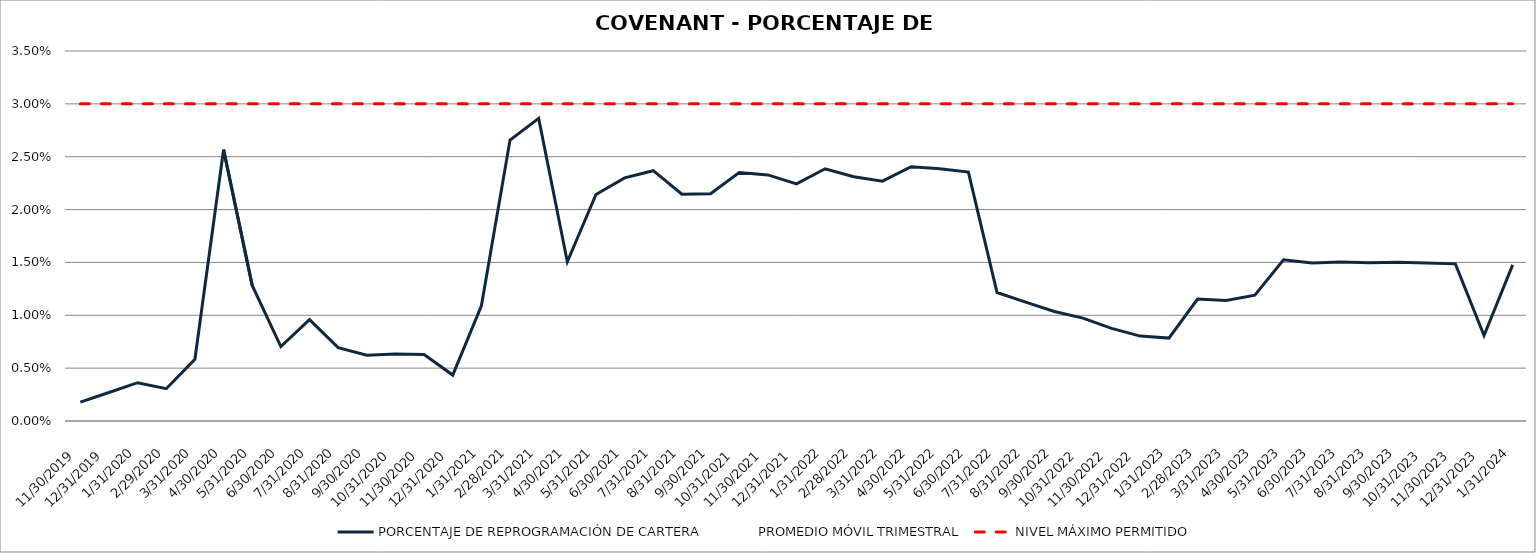
| Category | PORCENTAJE DE REPROGRAMACIÓN DE CARTERA | PROMEDIO MÓVIL TRIMESTRAL | NIVEL MÁXIMO PERMITIDO |
|---|---|---|---|
| 11/30/19 | 0.002 | 0 | 0.03 |
| 12/31/19 | 0.003 | 0 | 0.03 |
| 1/31/20 | 0.004 | 0.003 | 0.03 |
| 2/29/20 | 0.003 | 0.003 | 0.03 |
| 3/31/20 | 0.006 | 0.004 | 0.03 |
| 4/30/20 | 0.026 | 0.012 | 0.03 |
| 5/31/20 | 0.013 | 0.015 | 0.03 |
| 6/30/20 | 0.007 | 0.015 | 0.03 |
| 7/31/20 | 0.01 | 0.01 | 0.03 |
| 8/31/20 | 0.007 | 0.008 | 0.03 |
| 9/30/20 | 0.006 | 0.008 | 0.03 |
| 10/31/20 | 0.006 | 0.007 | 0.03 |
| 11/30/20 | 0.006 | 0.006 | 0.03 |
| 12/31/20 | 0.004 | 0.006 | 0.03 |
| 1/31/21 | 0.011 | 0.007 | 0.03 |
| 2/28/21 | 0.027 | 0.019 | 0.03 |
| 3/31/21 | 0.029 | 0.022 | 0.03 |
| 4/30/21 | 0.015 | 0.023 | 0.03 |
| 5/31/21 | 0.021 | 0.022 | 0.03 |
| 6/30/21 | 0.023 | 0.02 | 0.03 |
| 7/31/21 | 0.024 | 0.023 | 0.03 |
| 8/31/21 | 0.021 | 0.023 | 0.03 |
| 9/30/21 | 0.022 | 0.022 | 0.03 |
| 10/31/21 | 0.024 | 0.022 | 0.03 |
| 11/30/21 | 0.023 | 0.023 | 0.03 |
| 12/31/21 | 0.022 | 0.023 | 0.03 |
| 1/31/22 | 0.024 | 0.023 | 0.03 |
| 2/28/22 | 0.023 | 0.023 | 0.03 |
| 3/31/22 | 0.023 | 0.023 | 0.03 |
| 4/30/22 | 0.024 | 0.023 | 0.03 |
| 5/31/22 | 0.024 | 0.023 | 0.03 |
| 6/30/22 | 0.024 | 0.024 | 0.03 |
| 7/31/22 | 0.012 | 0.02 | 0.03 |
| 8/31/22 | 0.011 | 0.016 | 0.03 |
| 9/30/22 | 0.01 | 0.014 | 0.03 |
| 10/31/22 | 0.01 | 0.013 | 0.03 |
| 11/30/22 | 0.009 | 0.01 | 0.03 |
| 12/31/22 | 0.008 | 0.009 | 0.03 |
| 1/31/23 | 0.008 | 0.008 | 0.03 |
| 2/28/23 | 0.012 | 0.009 | 0.03 |
| 3/31/23 | 0.011 | 0.01 | 0.03 |
| 4/30/23 | 0.012 | 0.012 | 0.03 |
| 5/31/23 | 0.015 | 0.013 | 0.03 |
| 6/30/23 | 0.015 | 0.014 | 0.03 |
| 7/31/23 | 0.015 | 0.015 | 0.03 |
| 8/31/23 | 0.015 | 0.015 | 0.03 |
| 9/30/23 | 0.015 | 0.015 | 0.03 |
| 10/31/23 | 0.015 | 0.015 | 0.03 |
| 11/30/23 | 0.015 | 0.015 | 0.03 |
| 12/31/23 | 0.008 | 0.013 | 0.03 |
| 1/31/24 | 0.015 | 0.013 | 0.03 |